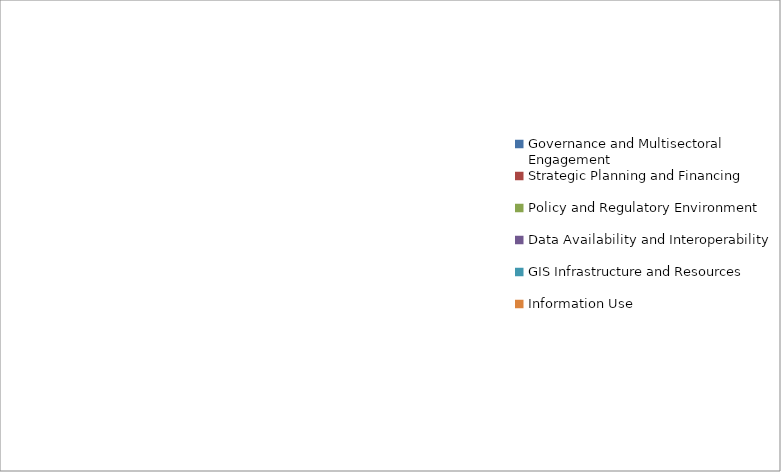
| Category | Series 0 |
|---|---|
| Governance and Multisectoral Engagement | 0 |
| Strategic Planning and Financing | 0 |
| Policy and Regulatory Environment | 0 |
| Data Availability and Interoperability | 0 |
| GIS Infrastructure and Resources | 0 |
| Information Use | 0 |